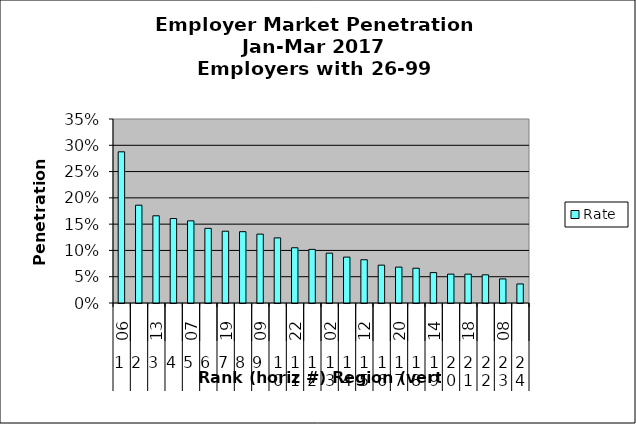
| Category | Rate |
|---|---|
| 0 | 0.288 |
| 1 | 0.186 |
| 2 | 0.166 |
| 3 | 0.161 |
| 4 | 0.156 |
| 5 | 0.142 |
| 6 | 0.137 |
| 7 | 0.136 |
| 8 | 0.131 |
| 9 | 0.124 |
| 10 | 0.105 |
| 11 | 0.102 |
| 12 | 0.095 |
| 13 | 0.087 |
| 14 | 0.082 |
| 15 | 0.072 |
| 16 | 0.068 |
| 17 | 0.066 |
| 18 | 0.058 |
| 19 | 0.055 |
| 20 | 0.055 |
| 21 | 0.054 |
| 22 | 0.046 |
| 23 | 0.036 |